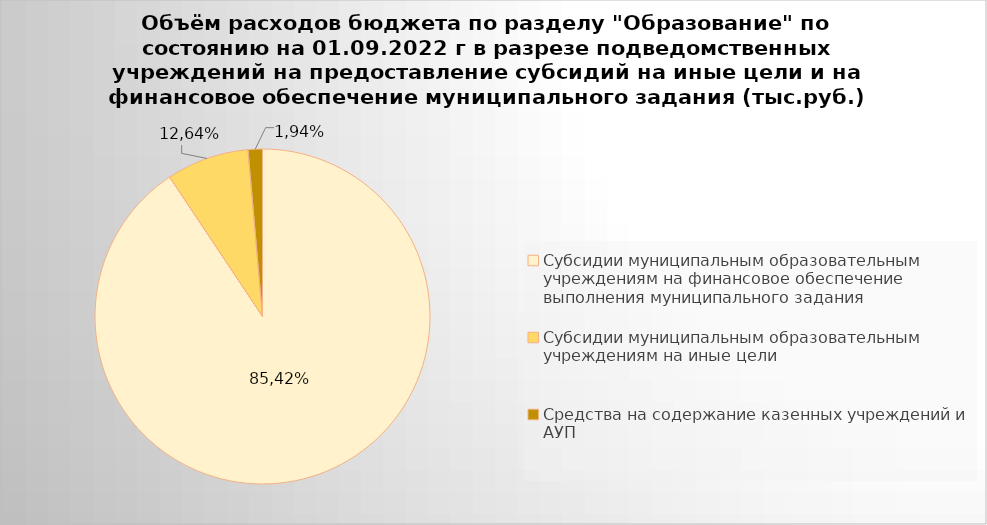
| Category | Series 0 |
|---|---|
| Субсидии муниципальным образовательным учреждениям на финансовое обеспечение выполнения муниципального задания | 7036146.5 |
| Субсидии муниципальным образовательным учреждениям на иные цели | 619016.85 |
| Средства на содержание казенных учреждений и АУП | 107250.66 |